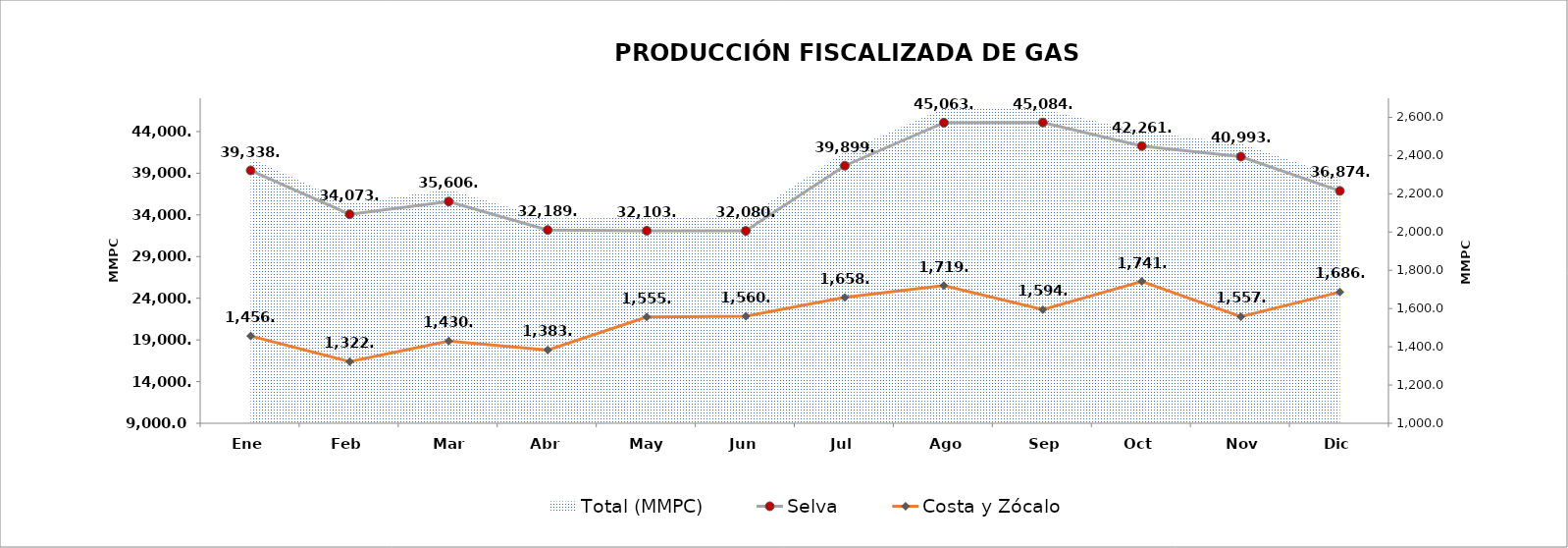
| Category | Selva |
|---|---|
| 43466.0 | 39338.007 |
| 43497.0 | 34073.7 |
| 43525.0 | 35606.386 |
| 43556.0 | 32189.402 |
| 43586.0 | 32103.051 |
| 43617.0 | 32080.267 |
| 43647.0 | 39899.869 |
| 43678.0 | 45063.7 |
| 43709.0 | 45084.563 |
| 43739.0 | 42261.281 |
| 43770.0 | 40993.912 |
| 43800.0 | 36874.503 |